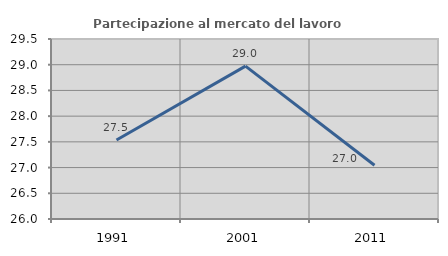
| Category | Partecipazione al mercato del lavoro  femminile |
|---|---|
| 1991.0 | 27.536 |
| 2001.0 | 28.972 |
| 2011.0 | 27.044 |